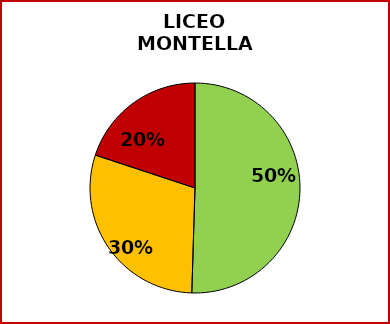
| Category | Series 0 |
|---|---|
| SUPERATI | 261 |
| PARZIAL.NTE SUPERATI | 153 |
| NON SUPERATI | 103 |